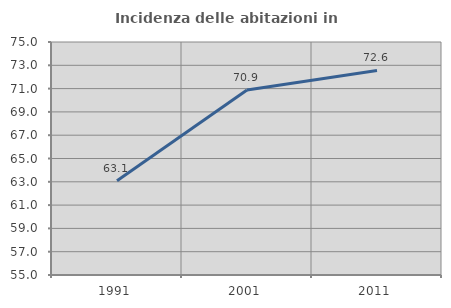
| Category | Incidenza delle abitazioni in proprietà  |
|---|---|
| 1991.0 | 63.092 |
| 2001.0 | 70.887 |
| 2011.0 | 72.557 |